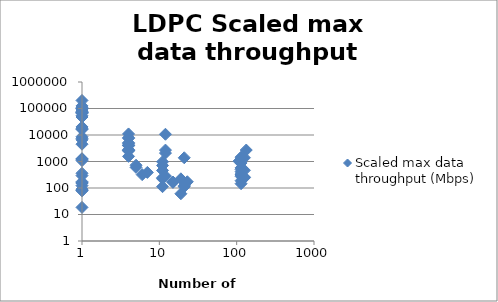
| Category | Scaled max data throughput (Mbps) |
|---|---|
| 107.0 | 1027.846 |
| 114.0 | 1456 |
| 19.0 | 222 |
| 133.0 | 2709.692 |
| 114.0 | 145.385 |
| 7.0 | 387.692 |
| 12.0 | 2695.588 |
| 114.0 | 497 |
| 114.0 | 333 |
| 11.0 | 708 |
| 11.0 | 975.6 |
| 11.0 | 459 |
| 21.0 | 112.154 |
| 11.0 | 243 |
| 11.0 | 224.308 |
| 5.0 | 600 |
| 21.0 | 121.5 |
| 15.0 | 168.231 |
| 15.0 | 162 |
| 21.0 | 1381.846 |
| 11.0 | 112.154 |
| 5.0 | 723.808 |
| 1.0 | 360 |
| 12.0 | 281 |
| 1.0 | 1080 |
| 114.0 | 276.923 |
| 126.0 | 465.231 |
| 126.0 | 244.518 |
| 126.0 | 1384.615 |
| 1.0 | 1230.769 |
| 126.0 | 257 |
| 1.0 | 293.538 |
| 114.0 | 1238 |
| 19.0 | 60.6 |
| 1.0 | 1230.769 |
| 1.0 | 171.662 |
| 1.0 | 153.569 |
| 1.0 | 158.738 |
| 1.0 | 122.769 |
| 1.0 | 153.354 |
| 1.0 | 18.523 |
| 1.0 | 90.462 |
| 1.0 | 83.569 |
| 1.0 | 84.215 |
| 1.0 | 78.4 |
| 1.0 | 82.277 |
| 1.0 | 17246.826 |
| 1.0 | 8581.348 |
| 1.0 | 71407.685 |
| 1.0 | 200826.833 |
| 1.0 | 20124.102 |
| 1.0 | 52909.25 |
| 4.0 | 7926.154 |
| 4.0 | 1560 |
| 4.0 | 2650 |
| 4.0 | 2650 |
| 4.0 | 3931.76 |
| 4.0 | 4200 |
| 1.0 | 69475.264 |
| 4.0 | 3988.923 |
| 1.0 | 125000 |
| 1.0 | 100000 |
| 114.0 | 310.952 |
| 12.0 | 10661.538 |
| 23.0 | 172 |
| 114.0 | 410 |
| 114.0 | 574 |
| 1.0 | 65800 |
| 1.0 | 88100 |
| 1.0 | 100300 |
| 1.0 | 47700 |
| 1.0 | 16186.154 |
| 6.0 | 319.2 |
| 114.0 | 188.308 |
| 114.0 | 879.648 |
| 4.0 | 10966.154 |
| 4.0 | 7515.625 |
| 1.0 | 1280 |
| 12.0 | 2076.923 |
| 1.0 | 4500 |
| 4.0 | 2502.5 |
| 4.0 | 5066.25 |
| 4.0 | 4875 |
| 1.0 | 6568.333 |
| 1.0 | 7475 |
| 1.0 | 78073.438 |
| 1.0 | 72100.146 |
| 4.0 | 2800 |
| 1.0 | 106257.275 |